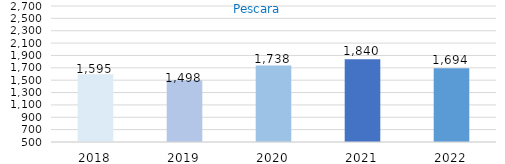
| Category | Series 0 |
|---|---|
| 2018.0 | 1595 |
| 2019.0 | 1498 |
| 2020.0 | 1738 |
| 2021.0 | 1840 |
| 2022.0 | 1694 |